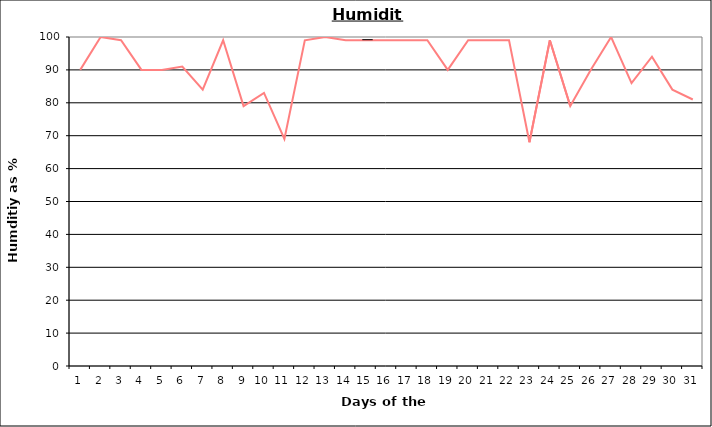
| Category | Series 0 |
|---|---|
| 0 | 90 |
| 1 | 100 |
| 2 | 99 |
| 3 | 90 |
| 4 | 90 |
| 5 | 91 |
| 6 | 84 |
| 7 | 99 |
| 8 | 79 |
| 9 | 83 |
| 10 | 69 |
| 11 | 99 |
| 12 | 100 |
| 13 | 99 |
| 14 | 99 |
| 15 | 99 |
| 16 | 99 |
| 17 | 99 |
| 18 | 90 |
| 19 | 99 |
| 20 | 99 |
| 21 | 99 |
| 22 | 68 |
| 23 | 99 |
| 24 | 79 |
| 25 | 90 |
| 26 | 100 |
| 27 | 86 |
| 28 | 94 |
| 29 | 84 |
| 30 | 81 |